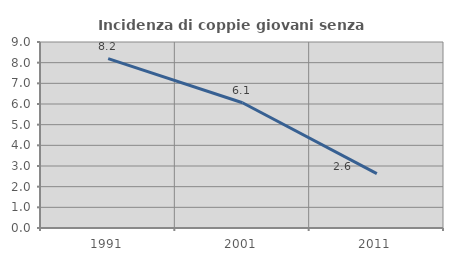
| Category | Incidenza di coppie giovani senza figli |
|---|---|
| 1991.0 | 8.197 |
| 2001.0 | 6.061 |
| 2011.0 | 2.632 |